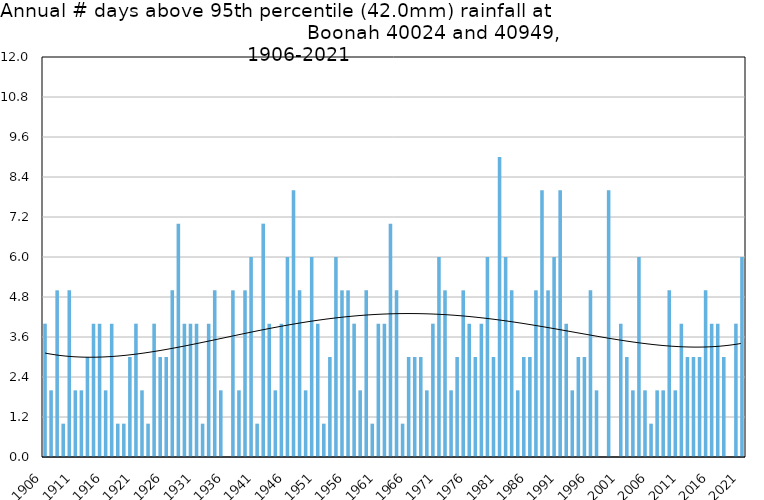
| Category | Annual # days above 95th percentile |
|---|---|
| 1906 | 4 |
| 1907 | 2 |
| 1908 | 5 |
| 1909 | 1 |
| 1910 | 5 |
| 1911 | 2 |
| 1912 | 2 |
| 1913 | 3 |
| 1914 | 4 |
| 1915 | 4 |
| 1916 | 2 |
| 1917 | 4 |
| 1918 | 1 |
| 1919 | 1 |
| 1920 | 3 |
| 1921 | 4 |
| 1922 | 2 |
| 1923 | 1 |
| 1924 | 4 |
| 1925 | 3 |
| 1926 | 3 |
| 1927 | 5 |
| 1928 | 7 |
| 1929 | 4 |
| 1930 | 4 |
| 1931 | 4 |
| 1932 | 1 |
| 1933 | 4 |
| 1934 | 5 |
| 1935 | 2 |
| 1936 | 0 |
| 1937 | 5 |
| 1938 | 2 |
| 1939 | 5 |
| 1940 | 6 |
| 1941 | 1 |
| 1942 | 7 |
| 1943 | 4 |
| 1944 | 2 |
| 1945 | 4 |
| 1946 | 6 |
| 1947 | 8 |
| 1948 | 5 |
| 1949 | 2 |
| 1950 | 6 |
| 1951 | 4 |
| 1952 | 1 |
| 1953 | 3 |
| 1954 | 6 |
| 1955 | 5 |
| 1956 | 5 |
| 1957 | 4 |
| 1958 | 2 |
| 1959 | 5 |
| 1960 | 1 |
| 1961 | 4 |
| 1962 | 4 |
| 1963 | 7 |
| 1964 | 5 |
| 1965 | 1 |
| 1966 | 3 |
| 1967 | 3 |
| 1968 | 3 |
| 1969 | 2 |
| 1970 | 4 |
| 1971 | 6 |
| 1972 | 5 |
| 1973 | 2 |
| 1974 | 3 |
| 1975 | 5 |
| 1976 | 4 |
| 1977 | 3 |
| 1978 | 4 |
| 1979 | 6 |
| 1980 | 3 |
| 1981 | 9 |
| 1982 | 6 |
| 1983 | 5 |
| 1984 | 2 |
| 1985 | 3 |
| 1986 | 3 |
| 1987 | 5 |
| 1988 | 8 |
| 1989 | 5 |
| 1990 | 6 |
| 1991 | 8 |
| 1992 | 4 |
| 1993 | 2 |
| 1994 | 3 |
| 1995 | 3 |
| 1996 | 5 |
| 1997 | 2 |
| 1998 | 0 |
| 1999 | 8 |
| 2000 | 0 |
| 2001 | 4 |
| 2002 | 3 |
| 2003 | 2 |
| 2004 | 6 |
| 2005 | 2 |
| 2006 | 1 |
| 2007 | 2 |
| 2008 | 2 |
| 2009 | 5 |
| 2010 | 2 |
| 2011 | 4 |
| 2012 | 3 |
| 2013 | 3 |
| 2014 | 3 |
| 2015 | 5 |
| 2016 | 4 |
| 2017 | 4 |
| 2018 | 3 |
| 2019 | 0 |
| 2020 | 4 |
| 2021 | 6 |